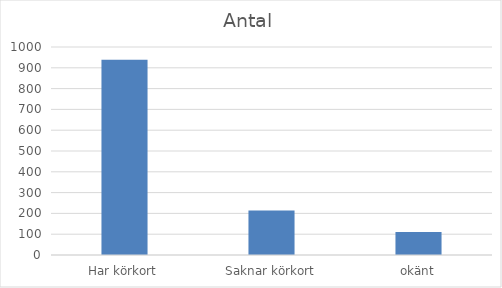
| Category | Antal |
|---|---|
| Har körkort | 939 |
| Saknar körkort | 214 |
| okänt | 110 |